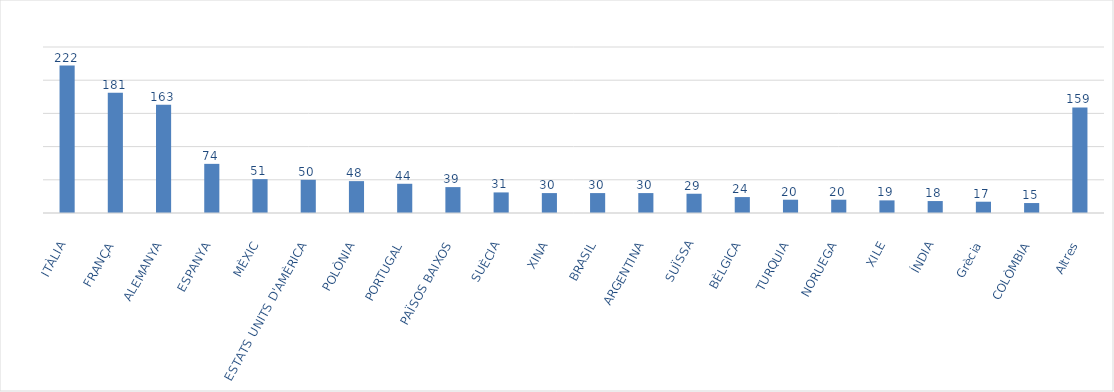
| Category | Series 0 |
|---|---|
| ITÀLIA | 222 |
| FRANÇA | 181 |
| ALEMANYA | 163 |
| ESPANYA | 74 |
| MÈXIC | 51 |
| ESTATS UNITS D'AMÈRICA | 50 |
| POLÒNIA | 48 |
| PORTUGAL | 44 |
| PAÏSOS BAIXOS | 39 |
| SUÈCIA | 31 |
| XINA | 30 |
| BRASIL | 30 |
| ARGENTINA | 30 |
| SUÏSSA | 29 |
| BÈLGICA | 24 |
| TURQUIA | 20 |
| NORUEGA | 20 |
| XILE | 19 |
| ÍNDIA | 18 |
| Grècia | 17 |
| COLÒMBIA | 15 |
| Altres | 159 |